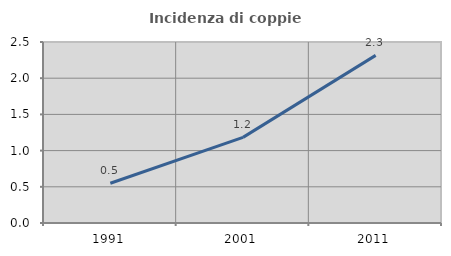
| Category | Incidenza di coppie miste |
|---|---|
| 1991.0 | 0.549 |
| 2001.0 | 1.183 |
| 2011.0 | 2.315 |